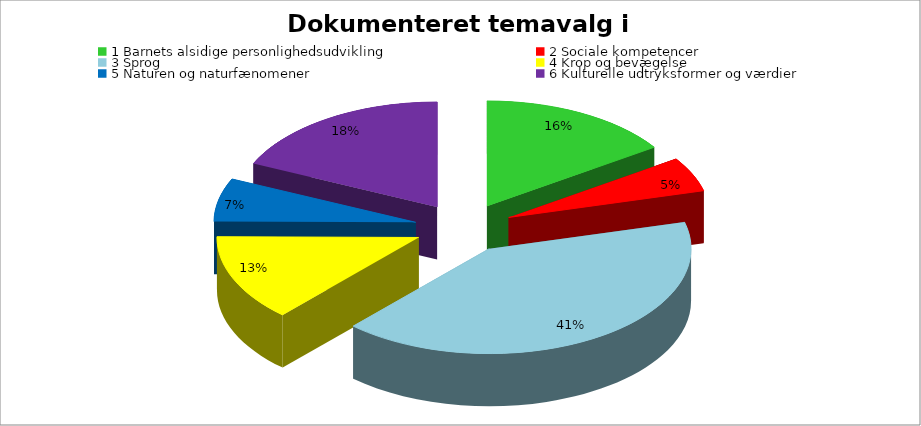
| Category | Dokumenteret temavalg |
|---|---|
| 0 | 35 |
| 1 | 12 |
| 2 | 92 |
| 3 | 30 |
| 4 | 15 |
| 5 | 41 |